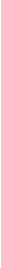
| Category | 20 czerwca  2018 r.
20 June  2018 |
|---|---|
| 0.0 | 17318.4 |
| 1.0 | 16631.9 |
| 2.0 | 16265.4 |
| 3.0 | 16132.9 |
| 4.0 | 15824.4 |
| 5.0 | 15821.6 |
| 6.0 | 16819.6 |
| 7.0 | 19513.3 |
| 8.0 | 21070.8 |
| 9.0 | 21931.3 |
| 10.0 | 22019.1 |
| 11.0 | 22354.9 |
| 12.0 | 22496.2 |
| 13.0 | 22752.1 |
| 14.0 | 22000.4 |
| 15.0 | 22215.9 |
| 16.0 | 22000.8 |
| 17.0 | 21646.1 |
| 18.0 | 21304.8 |
| 19.0 | 21270.8 |
| 20.0 | 21292.7 |
| 21.0 | 21223.9 |
| 22.0 | 20499.5 |
| 23.0 | 19453.6 |
| 24.0 | 17799.9 |